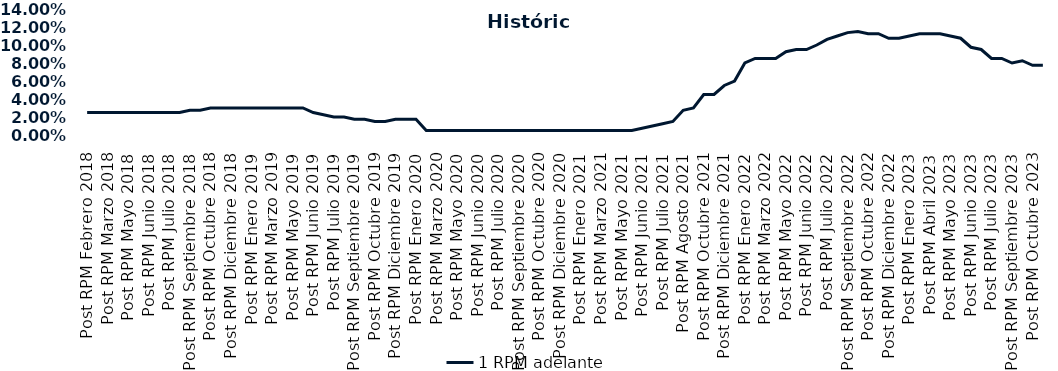
| Category | 1 RPM adelante |
|---|---|
| Post RPM Febrero 2018 | 0.025 |
| Pre RPM Marzo 2018 | 0.025 |
| Post RPM Marzo 2018 | 0.025 |
| Pre RPM Mayo 2018 | 0.025 |
| Post RPM Mayo 2018 | 0.025 |
| Pre RPM Junio 2018 | 0.025 |
| Post RPM Junio 2018 | 0.025 |
| Pre RPM Julio 2018 | 0.025 |
| Post RPM Julio 2018 | 0.025 |
| Pre RPM Septiembre 2018 | 0.025 |
| Post RPM Septiembre 2018 | 0.028 |
| Pre RPM Octubre 2018 | 0.028 |
| Post RPM Octubre 2018 | 0.03 |
| Pre RPM Diciembre 2018 | 0.03 |
| Post RPM Diciembre 2018 | 0.03 |
| Pre RPM Enero 2019 | 0.03 |
| Post RPM Enero 2019 | 0.03 |
| Pre RPM Marzo 2019 | 0.03 |
| Post RPM Marzo 2019 | 0.03 |
| Pre RPM Mayo 2019 | 0.03 |
| Post RPM Mayo 2019 | 0.03 |
| Pre RPM Junio 2019 | 0.03 |
| Post RPM Junio 2019 | 0.025 |
| Pre RPM Julio 2019 | 0.022 |
| Post RPM Julio 2019 | 0.02 |
| Pre RPM Septiembre 2019 | 0.02 |
| Post RPM Septiembre 2019 | 0.018 |
| Pre RPM Octubre 2019 | 0.018 |
| Post RPM Octubre 2019 | 0.015 |
| Pre RPM Diciembre 2019 | 0.015 |
| Post RPM Diciembre 2019 | 0.018 |
| Pre RPM Enero 2020 | 0.018 |
| Post RPM Enero 2020 | 0.018 |
| Pre RPM Marzo 2020 | 0.005 |
| Post RPM Marzo 2020 | 0.005 |
| Pre RPM Mayo 2020 | 0.005 |
| Post RPM Mayo 2020 | 0.005 |
| Pre RPM Junio 2020 | 0.005 |
| Post RPM Junio 2020 | 0.005 |
| Pre RPM Julio 2020 | 0.005 |
| Post RPM Julio 2020 | 0.005 |
| Pre RPM Septiembre 2020 | 0.005 |
| Post RPM Septiembre 2020 | 0.005 |
| Pre RPM Octubre 2020 | 0.005 |
| Post RPM Octubre 2020 | 0.005 |
| Pre RPM Diciembre 2020 | 0.005 |
| Post RPM Diciembre 2020 | 0.005 |
| Pre RPM Enero 2021 | 0.005 |
| Post RPM Enero 2021 | 0.005 |
| Pre RPM Marzo 2021 | 0.005 |
| Post RPM Marzo 2021 | 0.005 |
| Pre RPM Mayo 2021 | 0.005 |
| Post RPM Mayo 2021 | 0.005 |
| Pre RPM Junio 2021 | 0.005 |
| Post RPM Junio 2021 | 0.008 |
| Pre RPM Julio 2021 | 0.01 |
| Post RPM Julio 2021 | 0.012 |
| Pre RPM Agosto 2021 | 0.015 |
| Post RPM Agosto 2021 | 0.028 |
| Pre RPM Octubre 2021 | 0.03 |
| Post RPM Octubre 2021 | 0.045 |
| Pre RPM Diciembre 2021 | 0.045 |
| Post RPM Diciembre 2021 | 0.055 |
| Pre RPM Enero 2022 | 0.06 |
| Post RPM Enero 2022 | 0.08 |
| Pre RPM Marzo 2022 | 0.085 |
| Post RPM Marzo 2022 | 0.085 |
| Pre RPM Mayo 2022 | 0.085 |
| Post RPM Mayo 2022 | 0.092 |
| Pre RPM Junio 2022 | 0.095 |
| Post RPM Junio 2022 | 0.095 |
| Pre RPM Julio 2022 | 0.1 |
| Post RPM Julio 2022 | 0.106 |
| Pre RPM Septiembre 2022 | 0.11 |
| Post RPM Septiembre 2022 | 0.114 |
| Pre RPM Octubre 2022 | 0.115 |
| Post RPM Octubre 2022 | 0.112 |
| Pre RPM Diciembre 2022 | 0.112 |
| Post RPM Diciembre 2022 | 0.108 |
| Pre RPM Enero 2023 | 0.108 |
| Post RPM Enero 2023 | 0.11 |
| Pre RPM Abril 2023 | 0.112 |
| Post RPM Abril 2023 | 0.112 |
| Pre RPM Mayo 2023 | 0.112 |
| Post RPM Mayo 2023 | 0.11 |
| Pre RPM Junio 2023 | 0.108 |
| Post RPM Junio 2023 | 0.098 |
| Pre RPM Julio 2023 | 0.095 |
| Post RPM Julio 2023 | 0.085 |
| Pre RPM Septiembre 2023 | 0.085 |
| Post RPM Septiembre 2023 | 0.08 |
| Pre RPM Octubre 2023 | 0.082 |
| Post RPM Octubre 2023 | 0.078 |
| Pre RPM Diciembre 2023 | 0.078 |